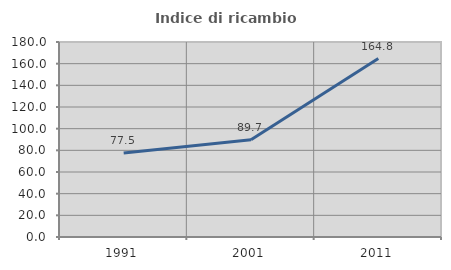
| Category | Indice di ricambio occupazionale  |
|---|---|
| 1991.0 | 77.533 |
| 2001.0 | 89.674 |
| 2011.0 | 164.754 |